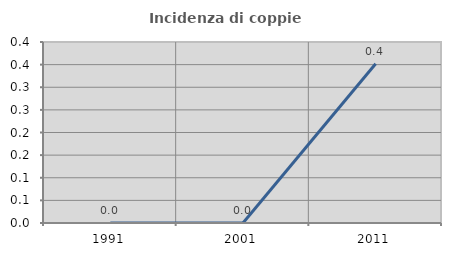
| Category | Incidenza di coppie miste |
|---|---|
| 1991.0 | 0 |
| 2001.0 | 0 |
| 2011.0 | 0.352 |